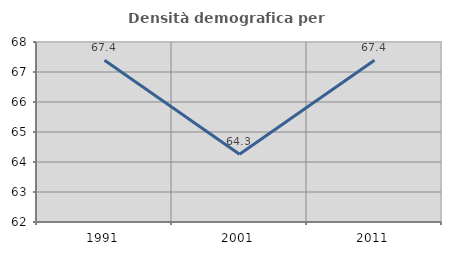
| Category | Densità demografica |
|---|---|
| 1991.0 | 67.394 |
| 2001.0 | 64.259 |
| 2011.0 | 67.394 |